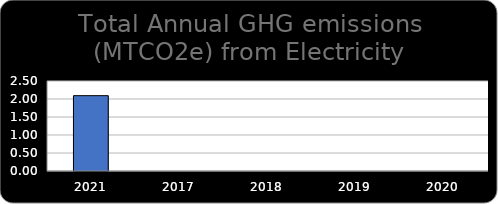
| Category | Series 0 |
|---|---|
| 2021.0 | 2.093 |
| 2017.0 | 0 |
| 2018.0 | 0 |
| 2019.0 | 0 |
| 2020.0 | 0 |